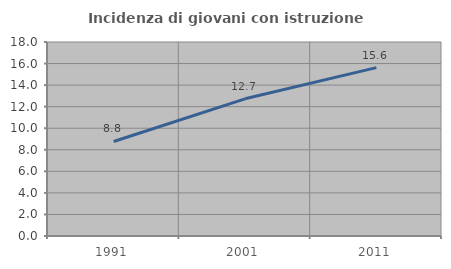
| Category | Incidenza di giovani con istruzione universitaria |
|---|---|
| 1991.0 | 8.772 |
| 2001.0 | 12.727 |
| 2011.0 | 15.625 |